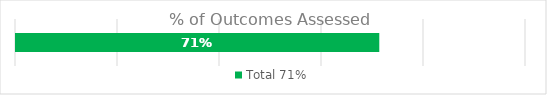
| Category | Total |
|---|---|
| 0 | 0.714 |